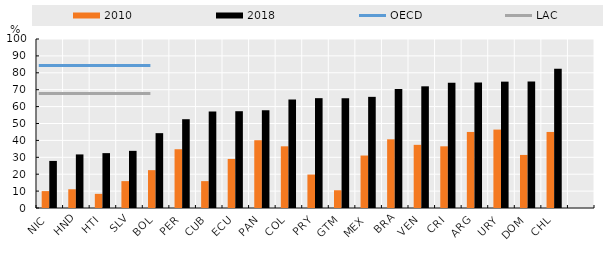
| Category | 2010 | 2018 |
|---|---|---|
| NIC | 10 | 27.86 |
| HND | 11.09 | 31.7 |
| HTI | 8.37 | 32.47 |
| SLV | 15.9 | 33.82 |
| BOL | 22.4 | 44.29 |
| PER | 34.77 | 52.54 |
| CUB | 15.9 | 57.15 |
| ECU | 29.03 | 57.27 |
| PAN | 40.1 | 57.87 |
| COL | 36.5 | 64.13 |
| PRY | 19.8 | 64.99 |
| GTM | 10.5 | 65 |
| MEX | 31.05 | 65.77 |
| BRA | 40.65 | 70.43 |
| VEN | 37.37 | 72 |
| CRI | 36.5 | 74.09 |
| ARG | 45 | 74.29 |
| URY | 46.4 | 74.77 |
| DOM | 31.4 | 74.82 |
| CHL | 45 | 82.33 |